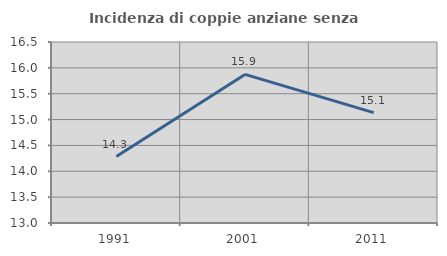
| Category | Incidenza di coppie anziane senza figli  |
|---|---|
| 1991.0 | 14.286 |
| 2001.0 | 15.873 |
| 2011.0 | 15.135 |